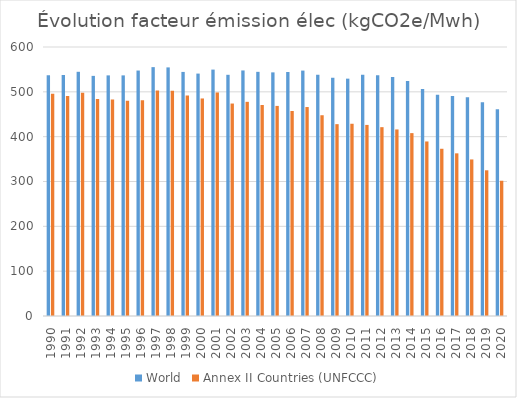
| Category | World | Annex II Countries (UNFCCC) |
|---|---|---|
| 1990 | 536.8 | 496 |
| 1991 | 537.6 | 490.9 |
| 1992 | 544.7 | 498 |
| 1993 | 535.6 | 483.9 |
| 1994 | 536.7 | 483 |
| 1995 | 536.7 | 480.2 |
| 1996 | 547.5 | 481.2 |
| 1997 | 555.1 | 502.8 |
| 1998 | 554.5 | 502.4 |
| 1999 | 544.4 | 491.8 |
| 2000 | 540.7 | 485.2 |
| 2001 | 549.6 | 498.6 |
| 2002 | 538 | 473.9 |
| 2003 | 547.7 | 477.7 |
| 2004 | 544.6 | 470.7 |
| 2005 | 543.4 | 468.6 |
| 2006 | 544.3 | 457.3 |
| 2007 | 547.4 | 466.1 |
| 2008 | 538.1 | 447.8 |
| 2009 | 531.4 | 427.9 |
| 2010 | 529.4 | 428.8 |
| 2011 | 538.3 | 426.2 |
| 2012 | 537.2 | 421.2 |
| 2013 | 533.2 | 416.1 |
| 2014 | 523.9 | 407.9 |
| 2015 | 506.5 | 389.3 |
| 2016 | 493.6 | 373 |
| 2017 | 490.6 | 362.8 |
| 2018 | 487.7 | 349.2 |
| 2019 | 476.7 | 325 |
| 2020 | 461.1 | 301.4 |